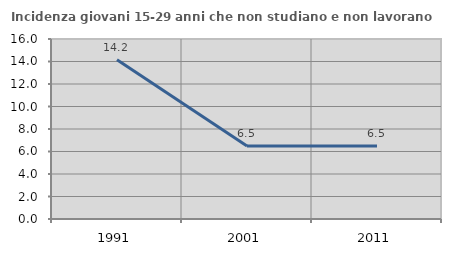
| Category | Incidenza giovani 15-29 anni che non studiano e non lavorano  |
|---|---|
| 1991.0 | 14.151 |
| 2001.0 | 6.49 |
| 2011.0 | 6.488 |